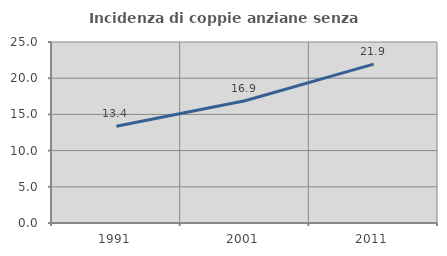
| Category | Incidenza di coppie anziane senza figli  |
|---|---|
| 1991.0 | 13.362 |
| 2001.0 | 16.89 |
| 2011.0 | 21.944 |